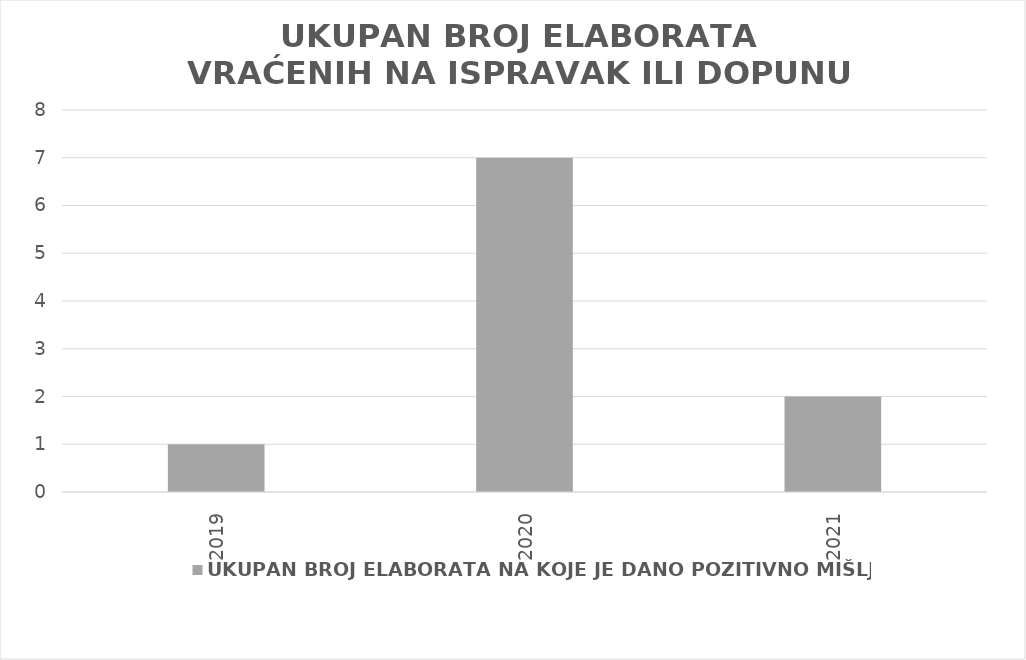
| Category | UKUPAN BROJ ELABORATA NA KOJE JE DANO POZITIVNO MIŠLJENJE |
|---|---|
| 2019.0 | 1 |
| 2020.0 | 7 |
| 2021.0 | 2 |